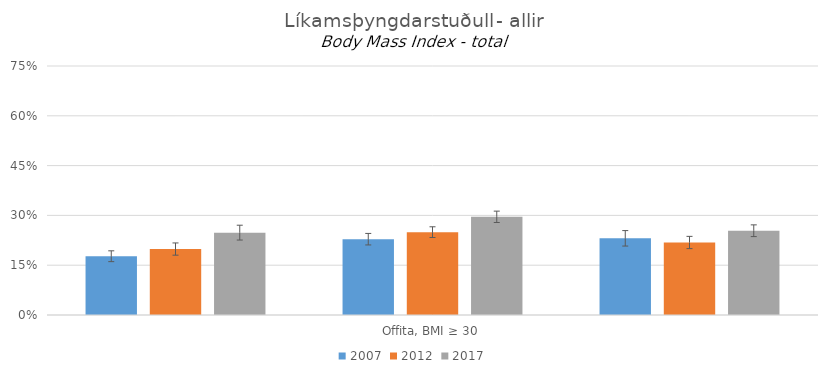
| Category | 2007 | 2012 | 2017 |
|---|---|---|---|
| 0 | 0.177 | 0.199 | 0.248 |
| 1 | 0.228 | 0.25 | 0.296 |
| 2 | 0.231 | 0.218 | 0.254 |